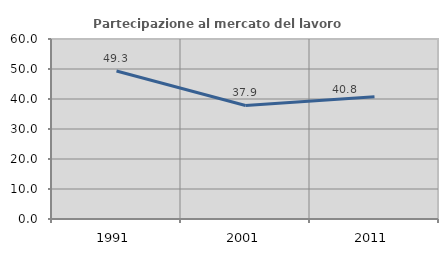
| Category | Partecipazione al mercato del lavoro  femminile |
|---|---|
| 1991.0 | 49.312 |
| 2001.0 | 37.851 |
| 2011.0 | 40.775 |